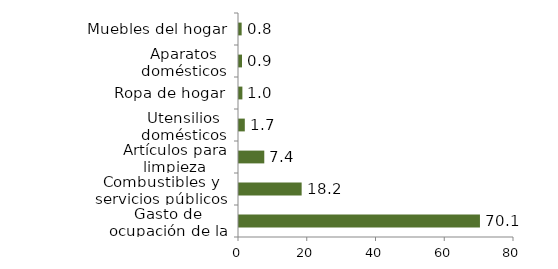
| Category | Vivienda |
|---|---|
| Gasto de ocupación de la vivienda | 70.095 |
| Combustibles y servicios públicos | 18.226 |
| Artículos para limpieza | 7.354 |
| Utensilios domésticos | 1.689 |
| Ropa de hogar | 0.983 |
| Aparatos domésticos | 0.878 |
| Muebles del hogar | 0.774 |